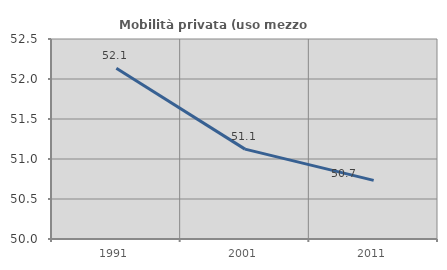
| Category | Mobilità privata (uso mezzo privato) |
|---|---|
| 1991.0 | 52.134 |
| 2001.0 | 51.124 |
| 2011.0 | 50.733 |